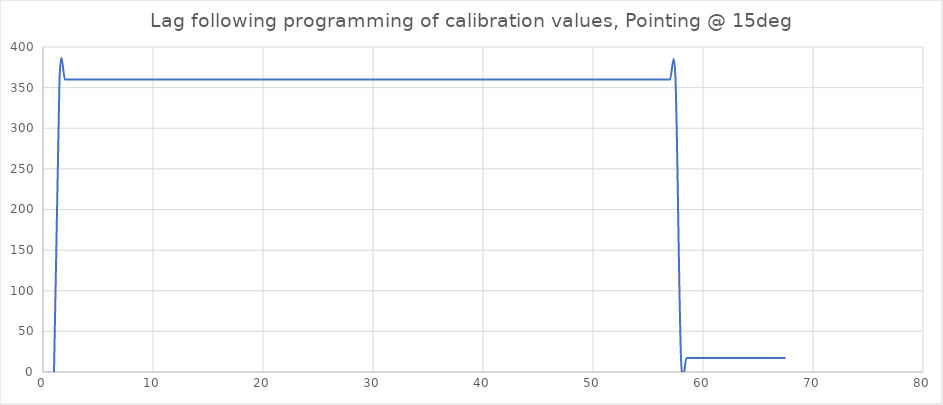
| Category | Column2 |
|---|---|
| 0.5 | 0 |
| 1.0 | 0 |
| 1.5 | 359.938 |
| 2.0 | 359.938 |
| 2.5 | 359.938 |
| 3.0 | 359.938 |
| 3.5 | 359.938 |
| 4.0 | 359.938 |
| 4.5 | 359.938 |
| 5.0 | 359.938 |
| 5.5 | 359.938 |
| 6.0 | 359.938 |
| 6.5 | 359.938 |
| 7.0 | 359.938 |
| 7.5 | 359.938 |
| 8.0 | 359.938 |
| 8.5 | 359.938 |
| 9.0 | 359.938 |
| 9.5 | 359.938 |
| 10.0 | 359.938 |
| 10.5 | 359.938 |
| 11.0 | 359.938 |
| 11.5 | 359.938 |
| 12.0 | 359.938 |
| 12.5 | 359.938 |
| 13.0 | 359.938 |
| 13.5 | 359.938 |
| 14.0 | 359.938 |
| 14.5 | 359.938 |
| 15.0 | 359.938 |
| 15.5 | 359.938 |
| 16.0 | 359.938 |
| 16.5 | 359.938 |
| 17.0 | 359.938 |
| 17.5 | 359.938 |
| 18.0 | 359.938 |
| 18.5 | 359.938 |
| 19.0 | 359.938 |
| 19.5 | 359.938 |
| 20.0 | 359.938 |
| 20.5 | 359.938 |
| 21.0 | 359.938 |
| 21.5 | 359.938 |
| 22.0 | 359.938 |
| 22.5 | 359.938 |
| 23.0 | 359.938 |
| 23.5 | 359.938 |
| 24.0 | 359.938 |
| 24.5 | 359.938 |
| 25.0 | 359.938 |
| 25.5 | 359.938 |
| 26.0 | 359.938 |
| 26.5 | 359.938 |
| 27.0 | 359.938 |
| 27.5 | 359.938 |
| 28.0 | 359.938 |
| 28.5 | 359.938 |
| 29.0 | 359.938 |
| 29.5 | 359.938 |
| 30.0 | 359.938 |
| 30.5 | 359.938 |
| 31.0 | 359.938 |
| 31.5 | 359.938 |
| 32.0 | 359.938 |
| 32.5 | 359.938 |
| 33.0 | 359.938 |
| 33.5 | 359.938 |
| 34.0 | 359.938 |
| 34.5 | 359.938 |
| 35.0 | 359.938 |
| 35.5 | 359.938 |
| 36.0 | 359.938 |
| 36.5 | 359.938 |
| 37.0 | 359.938 |
| 37.5 | 359.938 |
| 38.0 | 359.938 |
| 38.5 | 359.938 |
| 39.0 | 359.938 |
| 39.5 | 359.938 |
| 40.0 | 359.938 |
| 40.5 | 359.938 |
| 41.0 | 359.938 |
| 41.5 | 359.938 |
| 42.0 | 359.938 |
| 42.5 | 359.938 |
| 43.0 | 359.938 |
| 43.5 | 359.938 |
| 44.0 | 359.938 |
| 44.5 | 359.938 |
| 45.0 | 359.938 |
| 45.5 | 359.938 |
| 46.0 | 359.938 |
| 46.5 | 359.938 |
| 47.0 | 359.938 |
| 47.5 | 359.938 |
| 48.0 | 359.938 |
| 48.5 | 359.938 |
| 49.0 | 359.938 |
| 49.5 | 359.938 |
| 50.0 | 359.938 |
| 50.5 | 359.938 |
| 51.0 | 359.938 |
| 51.5 | 359.938 |
| 52.0 | 359.938 |
| 52.5 | 359.938 |
| 53.0 | 359.938 |
| 53.5 | 359.938 |
| 54.0 | 359.938 |
| 54.5 | 359.938 |
| 55.0 | 359.938 |
| 55.5 | 359.938 |
| 56.0 | 359.938 |
| 56.5 | 359.938 |
| 57.0 | 359.938 |
| 57.5 | 359.938 |
| 58.0 | 17.188 |
| 58.5 | 17.188 |
| 59.0 | 17.188 |
| 59.5 | 17.188 |
| 60.0 | 17.188 |
| 60.5 | 17.188 |
| 61.0 | 17.188 |
| 61.5 | 17.188 |
| 62.0 | 17.188 |
| 62.5 | 17.188 |
| 63.0 | 17.188 |
| 63.5 | 17.188 |
| 64.0 | 17.188 |
| 64.5 | 17.188 |
| 65.0 | 17.188 |
| 65.5 | 17.188 |
| 66.0 | 17.188 |
| 66.5 | 17.188 |
| 67.0 | 17.188 |
| 67.5 | 17.188 |